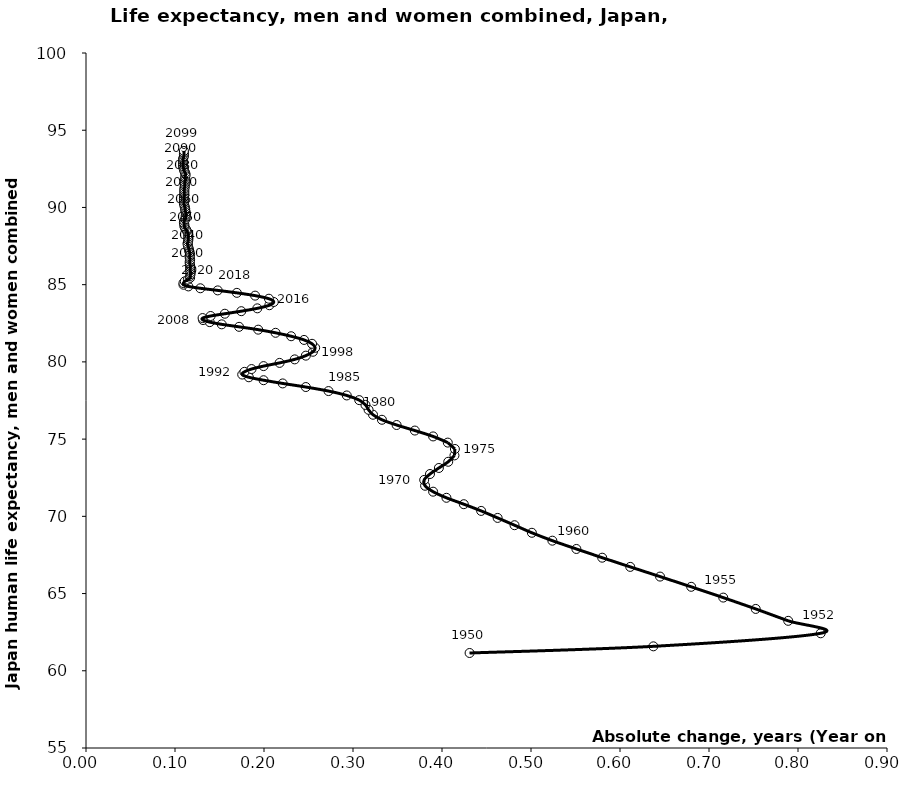
| Category | Series 0 |
|---|---|
| 0.4309999999999974 | 61.152 |
| 0.6374999999999993 | 61.583 |
| 0.8255000000000017 | 62.427 |
| 0.7889999999999979 | 63.234 |
| 0.7525000000000013 | 64.005 |
| 0.7160000000000011 | 64.739 |
| 0.6799999999999997 | 65.437 |
| 0.6450000000000031 | 66.099 |
| 0.6114999999999995 | 66.727 |
| 0.5799999999999983 | 67.322 |
| 0.5510000000000019 | 67.887 |
| 0.5240000000000009 | 68.424 |
| 0.5009999999999977 | 68.935 |
| 0.48149999999999693 | 69.426 |
| 0.4624999999999986 | 69.898 |
| 0.4440000000000026 | 70.351 |
| 0.4245000000000019 | 70.786 |
| 0.40500000000000114 | 71.2 |
| 0.39000000000000057 | 71.596 |
| 0.3810000000000002 | 71.98 |
| 0.37999999999999545 | 72.358 |
| 0.38649999999999807 | 72.74 |
| 0.3965000000000032 | 73.131 |
| 0.4069999999999965 | 73.533 |
| 0.4140000000000015 | 73.945 |
| 0.41450000000000387 | 74.361 |
| 0.4065000000000012 | 74.774 |
| 0.39000000000000057 | 75.174 |
| 0.36949999999999505 | 75.554 |
| 0.34899999999999665 | 75.913 |
| 0.3325000000000031 | 76.252 |
| 0.3225000000000051 | 76.578 |
| 0.31749999999999545 | 76.897 |
| 0.31400000000000006 | 77.213 |
| 0.30700000000000216 | 77.525 |
| 0.29299999999999926 | 77.827 |
| 0.27250000000000085 | 78.111 |
| 0.2469999999999999 | 78.372 |
| 0.22099999999999653 | 78.605 |
| 0.19950000000000045 | 78.814 |
| 0.18300000000000693 | 79.004 |
| 0.17549999999999955 | 79.18 |
| 0.17799999999999727 | 79.355 |
| 0.18599999999999994 | 79.536 |
| 0.19950000000000045 | 79.727 |
| 0.21750000000000114 | 79.935 |
| 0.23449999999999704 | 80.162 |
| 0.2469999999999999 | 80.404 |
| 0.25500000000000256 | 80.656 |
| 0.2575000000000003 | 80.914 |
| 0.2539999999999978 | 81.171 |
| 0.24499999999999744 | 81.422 |
| 0.23049999999999926 | 81.661 |
| 0.21300000000000097 | 81.883 |
| 0.19350000000000023 | 82.087 |
| 0.17199999999999704 | 82.27 |
| 0.1525000000000034 | 82.431 |
| 0.1390000000000029 | 82.575 |
| 0.1314999999999955 | 82.709 |
| 0.13100000000000023 | 82.838 |
| 0.14000000000000057 | 82.971 |
| 0.1559999999999988 | 83.118 |
| 0.17450000000000188 | 83.283 |
| 0.19250000000000256 | 83.467 |
| 0.20600000000000307 | 83.668 |
| 0.21099999999999852 | 83.879 |
| 0.20550000000000068 | 84.09 |
| 0.18999999999999773 | 84.29 |
| 0.16949999999999932 | 84.47 |
| 0.14800000000000324 | 84.629 |
| 0.1284999999999954 | 84.766 |
| 0.11499999999999488 | 84.886 |
| 0.10950000000000415 | 84.996 |
| 0.10950000000000415 | 85.105 |
| 0.1109999999999971 | 85.215 |
| 0.1144999999999996 | 85.327 |
| 0.11700000000000443 | 85.444 |
| 0.11699999999999733 | 85.561 |
| 0.11749999999999972 | 85.678 |
| 0.11749999999999972 | 85.796 |
| 0.11699999999999733 | 85.913 |
| 0.11700000000000443 | 86.03 |
| 0.11699999999999733 | 86.147 |
| 0.11699999999999733 | 86.264 |
| 0.11650000000000205 | 86.381 |
| 0.11650000000000205 | 86.497 |
| 0.11699999999999733 | 86.614 |
| 0.11649999999999494 | 86.731 |
| 0.11650000000000205 | 86.847 |
| 0.11700000000000443 | 86.964 |
| 0.11650000000000205 | 87.081 |
| 0.11599999999999966 | 87.197 |
| 0.11549999999999727 | 87.313 |
| 0.11500000000000199 | 87.428 |
| 0.1144999999999996 | 87.543 |
| 0.11399999999999721 | 87.657 |
| 0.1144999999999996 | 87.771 |
| 0.11500000000000199 | 87.886 |
| 0.11500000000000199 | 88.001 |
| 0.11499999999999488 | 88.116 |
| 0.11500000000000199 | 88.231 |
| 0.1144999999999996 | 88.346 |
| 0.11349999999999483 | 88.46 |
| 0.11250000000000426 | 88.573 |
| 0.1110000000000042 | 88.685 |
| 0.11050000000000182 | 88.795 |
| 0.11050000000000182 | 88.906 |
| 0.10999999999999943 | 89.016 |
| 0.11049999999999471 | 89.126 |
| 0.11149999999999949 | 89.237 |
| 0.11200000000000188 | 89.349 |
| 0.11199999999999477 | 89.461 |
| 0.11250000000000426 | 89.573 |
| 0.11200000000000188 | 89.686 |
| 0.11149999999999949 | 89.797 |
| 0.11149999999999949 | 89.909 |
| 0.1109999999999971 | 90.02 |
| 0.11050000000000182 | 90.131 |
| 0.10999999999999943 | 90.241 |
| 0.10999999999999943 | 90.351 |
| 0.10999999999999943 | 90.461 |
| 0.10999999999999943 | 90.571 |
| 0.10999999999999943 | 90.681 |
| 0.11050000000000182 | 90.791 |
| 0.11050000000000182 | 90.902 |
| 0.11050000000000182 | 91.012 |
| 0.11050000000000182 | 91.123 |
| 0.11049999999999471 | 91.233 |
| 0.1109999999999971 | 91.344 |
| 0.1110000000000042 | 91.455 |
| 0.1110000000000042 | 91.566 |
| 0.1109999999999971 | 91.677 |
| 0.11149999999999949 | 91.788 |
| 0.11149999999999949 | 91.9 |
| 0.11149999999999949 | 92.011 |
| 0.11200000000000188 | 92.123 |
| 0.11149999999999949 | 92.235 |
| 0.11050000000000182 | 92.346 |
| 0.10999999999999943 | 92.456 |
| 0.10949999999999704 | 92.566 |
| 0.10900000000000176 | 92.675 |
| 0.10900000000000176 | 92.784 |
| 0.10899999999999466 | 92.893 |
| 0.10900000000000176 | 93.002 |
| 0.10900000000000176 | 93.111 |
| 0.10949999999999704 | 93.22 |
| 0.10999999999999943 | 93.33 |
| 0.10999999999999943 | 93.44 |
| 0.10999999999999943 | 93.55 |
| 0.10999999999999943 | 93.66 |